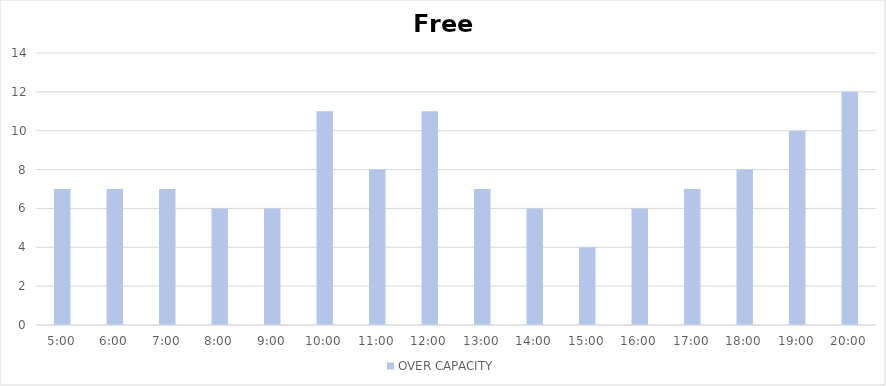
| Category | OVER CAPACITY |
|---|---|
| 0.20833333333333334 | 7 |
| 0.25 | 7 |
| 0.2916666666666667 | 7 |
| 0.3333333333333333 | 6 |
| 0.375 | 6 |
| 0.4166666666666667 | 11 |
| 0.4583333333333333 | 8 |
| 0.5 | 11 |
| 0.5416666666666666 | 7 |
| 0.5833333333333334 | 6 |
| 0.625 | 4 |
| 0.6666666666666666 | 6 |
| 0.7083333333333334 | 7 |
| 0.75 | 8 |
| 0.7916666666666666 | 10 |
| 0.8333333333333334 | 12 |